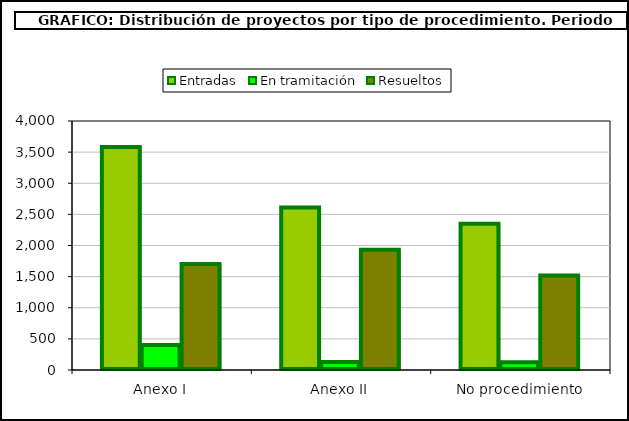
| Category | Entradas | En tramitación | Resueltos |
|---|---|---|---|
| Anexo I | 3582 | 401 | 1703 |
| Anexo II | 2610 | 128 | 1932 |
| No procedimiento | 2350 | 123 | 1520 |